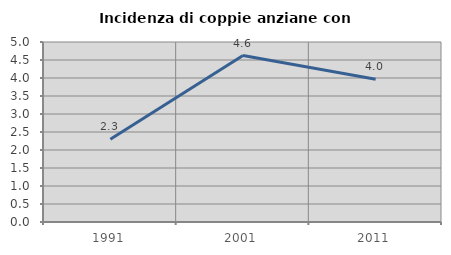
| Category | Incidenza di coppie anziane con figli |
|---|---|
| 1991.0 | 2.299 |
| 2001.0 | 4.624 |
| 2011.0 | 3.963 |